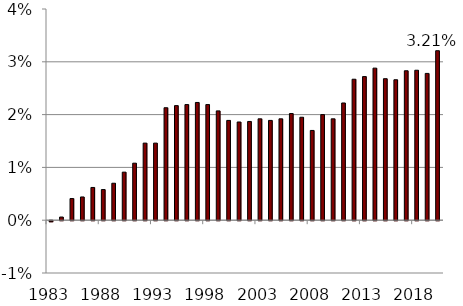
| Category | Deficit |
|---|---|
| 1983.0 | 0 |
| 1984.0 | 0.001 |
| 1985.0 | 0.004 |
| 1986.0 | 0.004 |
| 1987.0 | 0.006 |
| 1988.0 | 0.006 |
| 1989.0 | 0.007 |
| 1990.0 | 0.009 |
| 1991.0 | 0.011 |
| 1992.0 | 0.015 |
| 1993.0 | 0.015 |
| 1994.0 | 0.021 |
| 1995.0 | 0.022 |
| 1996.0 | 0.022 |
| 1997.0 | 0.022 |
| 1998.0 | 0.022 |
| 1999.0 | 0.021 |
| 2000.0 | 0.019 |
| 2001.0 | 0.019 |
| 2002.0 | 0.019 |
| 2003.0 | 0.019 |
| 2004.0 | 0.019 |
| 2005.0 | 0.019 |
| 2006.0 | 0.02 |
| 2007.0 | 0.02 |
| 2008.0 | 0.017 |
| 2009.0 | 0.02 |
| 2010.0 | 0.019 |
| 2011.0 | 0.022 |
| 2012.0 | 0.027 |
| 2013.0 | 0.027 |
| 2014.0 | 0.029 |
| 2015.0 | 0.027 |
| 2016.0 | 0.027 |
| 2017.0 | 0.028 |
| 2018.0 | 0.028 |
| 2019.0 | 0.028 |
| 2020.0 | 0.032 |